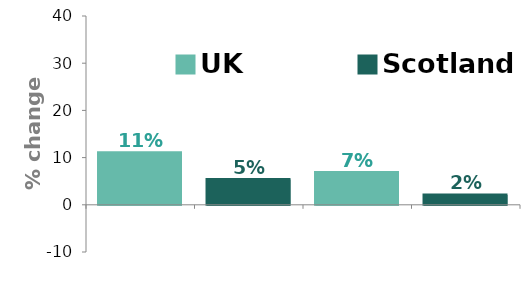
| Category | 2016-2041 |
|---|---|
| UK | 11.054 |
| Scotland | 5.338 |
| UK | 6.834 |
| Scotland | 2.058 |